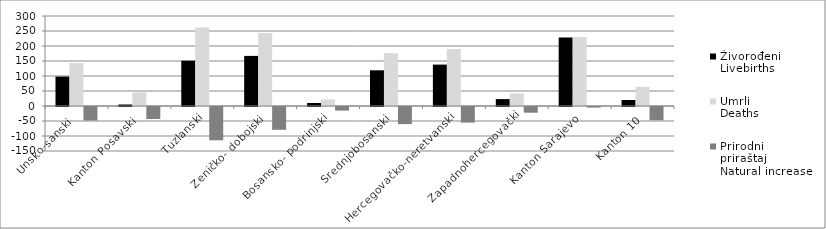
| Category | Živorođeni
Livebirths | Umrli
Deaths | Prirodni
priraštaj
Natural increase |
|---|---|---|---|
| Unsko-sanski  | 98 | 143 | -45 |
| Kanton Posavski  | 5 | 45 | -40 |
| Tuzlanski | 151 | 262 | -111 |
| Zeničko- dobojski | 167 | 243 | -76 |
| Bosansko- podrinjski | 10 | 22 | -12 |
| Srednjobosanski | 119 | 176 | -57 |
| Hercegovačko-neretvanski | 138 | 190 | -52 |
| Zapadnohercegovački | 23 | 42 | -19 |
| Kanton Sarajevo | 228 | 230 | -2 |
| Kanton 10 | 20 | 64 | -44 |